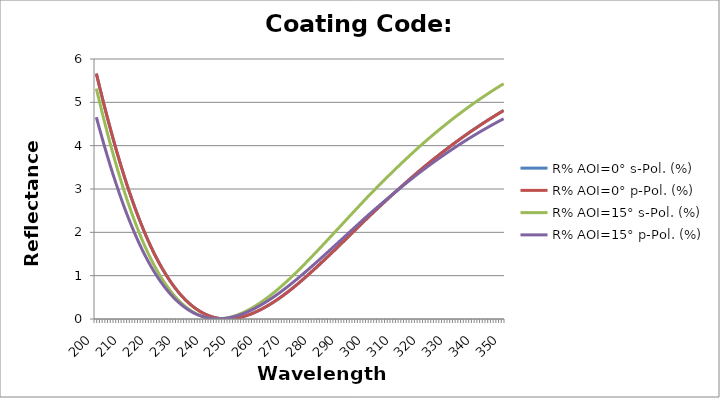
| Category | R% AOI=0° s-Pol. (%) | R% AOI=0° p-Pol. (%) | R% AOI=15° s-Pol. (%) | R% AOI=15° p-Pol. (%) |
|---|---|---|---|---|
| 200.0 | 5.663 | 5.663 | 5.316 | 4.657 |
| 201.0 | 5.404 | 5.404 | 5.054 | 4.426 |
| 202.0 | 5.15 | 5.15 | 4.798 | 4.201 |
| 203.0 | 4.903 | 4.903 | 4.549 | 3.983 |
| 204.0 | 4.662 | 4.662 | 4.307 | 3.77 |
| 205.0 | 4.426 | 4.426 | 4.072 | 3.564 |
| 206.0 | 4.198 | 4.198 | 3.843 | 3.365 |
| 207.0 | 3.975 | 3.975 | 3.622 | 3.171 |
| 208.0 | 3.759 | 3.759 | 3.408 | 2.984 |
| 209.0 | 3.55 | 3.55 | 3.201 | 2.803 |
| 210.0 | 3.347 | 3.347 | 3.001 | 2.628 |
| 211.0 | 3.151 | 3.151 | 2.809 | 2.46 |
| 212.0 | 2.962 | 2.962 | 2.624 | 2.299 |
| 213.0 | 2.779 | 2.779 | 2.447 | 2.144 |
| 214.0 | 2.603 | 2.603 | 2.276 | 1.995 |
| 215.0 | 2.434 | 2.434 | 2.112 | 1.852 |
| 216.0 | 2.27 | 2.27 | 1.955 | 1.715 |
| 217.0 | 2.113 | 2.113 | 1.805 | 1.584 |
| 218.0 | 1.963 | 1.963 | 1.662 | 1.459 |
| 219.0 | 1.819 | 1.819 | 1.525 | 1.34 |
| 220.0 | 1.68 | 1.68 | 1.395 | 1.227 |
| 221.0 | 1.55 | 1.55 | 1.273 | 1.12 |
| 222.0 | 1.425 | 1.425 | 1.157 | 1.019 |
| 223.0 | 1.307 | 1.307 | 1.048 | 0.924 |
| 224.0 | 1.194 | 1.194 | 0.945 | 0.834 |
| 225.0 | 1.087 | 1.087 | 0.848 | 0.749 |
| 226.0 | 0.986 | 0.986 | 0.756 | 0.669 |
| 227.0 | 0.891 | 0.891 | 0.671 | 0.595 |
| 228.0 | 0.801 | 0.801 | 0.591 | 0.525 |
| 229.0 | 0.716 | 0.716 | 0.517 | 0.46 |
| 230.0 | 0.637 | 0.637 | 0.449 | 0.401 |
| 231.0 | 0.563 | 0.563 | 0.386 | 0.345 |
| 232.0 | 0.494 | 0.494 | 0.328 | 0.295 |
| 233.0 | 0.43 | 0.43 | 0.276 | 0.249 |
| 234.0 | 0.371 | 0.371 | 0.228 | 0.207 |
| 235.0 | 0.317 | 0.317 | 0.185 | 0.169 |
| 236.0 | 0.268 | 0.268 | 0.148 | 0.136 |
| 237.0 | 0.223 | 0.223 | 0.114 | 0.106 |
| 238.0 | 0.182 | 0.182 | 0.086 | 0.081 |
| 239.0 | 0.146 | 0.146 | 0.061 | 0.059 |
| 240.0 | 0.114 | 0.114 | 0.042 | 0.041 |
| 241.0 | 0.087 | 0.087 | 0.026 | 0.027 |
| 242.0 | 0.063 | 0.063 | 0.014 | 0.016 |
| 243.0 | 0.043 | 0.043 | 0.006 | 0.009 |
| 244.0 | 0.027 | 0.027 | 0.002 | 0.005 |
| 245.0 | 0.015 | 0.015 | 0.002 | 0.004 |
| 246.0 | 0.007 | 0.007 | 0.006 | 0.006 |
| 247.0 | 0.002 | 0.002 | 0.013 | 0.012 |
| 248.0 | 0 | 0 | 0.023 | 0.02 |
| 249.0 | 0.002 | 0.002 | 0.036 | 0.031 |
| 250.0 | 0.006 | 0.006 | 0.053 | 0.044 |
| 251.0 | 0.014 | 0.014 | 0.072 | 0.06 |
| 252.0 | 0.025 | 0.025 | 0.094 | 0.078 |
| 253.0 | 0.038 | 0.038 | 0.119 | 0.099 |
| 254.0 | 0.054 | 0.054 | 0.147 | 0.122 |
| 255.0 | 0.073 | 0.073 | 0.176 | 0.147 |
| 256.0 | 0.094 | 0.094 | 0.209 | 0.174 |
| 257.0 | 0.117 | 0.117 | 0.243 | 0.203 |
| 258.0 | 0.143 | 0.143 | 0.28 | 0.234 |
| 259.0 | 0.171 | 0.171 | 0.319 | 0.266 |
| 260.0 | 0.201 | 0.201 | 0.359 | 0.301 |
| 261.0 | 0.233 | 0.233 | 0.402 | 0.337 |
| 262.0 | 0.267 | 0.267 | 0.447 | 0.374 |
| 263.0 | 0.302 | 0.302 | 0.493 | 0.414 |
| 264.0 | 0.34 | 0.34 | 0.541 | 0.454 |
| 265.0 | 0.38 | 0.38 | 0.59 | 0.496 |
| 266.0 | 0.42 | 0.42 | 0.642 | 0.54 |
| 267.0 | 0.463 | 0.463 | 0.694 | 0.584 |
| 268.0 | 0.507 | 0.507 | 0.748 | 0.63 |
| 269.0 | 0.552 | 0.552 | 0.803 | 0.677 |
| 270.0 | 0.599 | 0.599 | 0.859 | 0.725 |
| 271.0 | 0.648 | 0.648 | 0.918 | 0.774 |
| 272.0 | 0.698 | 0.698 | 0.977 | 0.824 |
| 273.0 | 0.749 | 0.749 | 1.037 | 0.875 |
| 274.0 | 0.801 | 0.801 | 1.099 | 0.927 |
| 275.0 | 0.854 | 0.854 | 1.161 | 0.979 |
| 276.0 | 0.908 | 0.908 | 1.224 | 1.032 |
| 277.0 | 0.963 | 0.963 | 1.287 | 1.086 |
| 278.0 | 1.019 | 1.019 | 1.352 | 1.14 |
| 279.0 | 1.075 | 1.075 | 1.416 | 1.195 |
| 280.0 | 1.132 | 1.132 | 1.482 | 1.25 |
| 281.0 | 1.19 | 1.19 | 1.547 | 1.306 |
| 282.0 | 1.248 | 1.248 | 1.613 | 1.362 |
| 283.0 | 1.307 | 1.307 | 1.68 | 1.418 |
| 284.0 | 1.366 | 1.366 | 1.747 | 1.475 |
| 285.0 | 1.426 | 1.426 | 1.814 | 1.531 |
| 286.0 | 1.486 | 1.486 | 1.881 | 1.588 |
| 287.0 | 1.546 | 1.546 | 1.948 | 1.646 |
| 288.0 | 1.606 | 1.606 | 2.016 | 1.703 |
| 289.0 | 1.667 | 1.667 | 2.083 | 1.76 |
| 290.0 | 1.728 | 1.728 | 2.151 | 1.818 |
| 291.0 | 1.789 | 1.789 | 2.219 | 1.875 |
| 292.0 | 1.851 | 1.851 | 2.286 | 1.933 |
| 293.0 | 1.912 | 1.912 | 2.354 | 1.99 |
| 294.0 | 1.973 | 1.973 | 2.421 | 2.048 |
| 295.0 | 2.035 | 2.035 | 2.489 | 2.105 |
| 296.0 | 2.096 | 2.096 | 2.556 | 2.162 |
| 297.0 | 2.158 | 2.158 | 2.623 | 2.219 |
| 298.0 | 2.219 | 2.219 | 2.69 | 2.276 |
| 299.0 | 2.28 | 2.28 | 2.756 | 2.333 |
| 300.0 | 2.341 | 2.341 | 2.823 | 2.39 |
| 301.0 | 2.4 | 2.4 | 2.887 | 2.445 |
| 302.0 | 2.46 | 2.46 | 2.951 | 2.499 |
| 303.0 | 2.519 | 2.519 | 3.015 | 2.554 |
| 304.0 | 2.578 | 2.578 | 3.078 | 2.608 |
| 305.0 | 2.636 | 2.636 | 3.142 | 2.662 |
| 306.0 | 2.694 | 2.694 | 3.204 | 2.715 |
| 307.0 | 2.752 | 2.752 | 3.266 | 2.768 |
| 308.0 | 2.81 | 2.81 | 3.328 | 2.821 |
| 309.0 | 2.867 | 2.867 | 3.389 | 2.873 |
| 310.0 | 2.924 | 2.924 | 3.45 | 2.925 |
| 311.0 | 2.98 | 2.98 | 3.511 | 2.977 |
| 312.0 | 3.036 | 3.036 | 3.57 | 3.028 |
| 313.0 | 3.092 | 3.092 | 3.63 | 3.079 |
| 314.0 | 3.148 | 3.148 | 3.689 | 3.13 |
| 315.0 | 3.203 | 3.203 | 3.748 | 3.18 |
| 316.0 | 3.258 | 3.258 | 3.806 | 3.23 |
| 317.0 | 3.312 | 3.312 | 3.864 | 3.279 |
| 318.0 | 3.366 | 3.366 | 3.921 | 3.328 |
| 319.0 | 3.42 | 3.42 | 3.978 | 3.377 |
| 320.0 | 3.473 | 3.473 | 4.034 | 3.425 |
| 321.0 | 3.525 | 3.525 | 4.089 | 3.472 |
| 322.0 | 3.576 | 3.576 | 4.143 | 3.518 |
| 323.0 | 3.627 | 3.627 | 4.197 | 3.564 |
| 324.0 | 3.678 | 3.678 | 4.25 | 3.61 |
| 325.0 | 3.728 | 3.728 | 4.302 | 3.654 |
| 326.0 | 3.777 | 3.777 | 4.354 | 3.699 |
| 327.0 | 3.826 | 3.826 | 4.406 | 3.743 |
| 328.0 | 3.874 | 3.874 | 4.456 | 3.787 |
| 329.0 | 3.922 | 3.922 | 4.507 | 3.83 |
| 330.0 | 3.97 | 3.97 | 4.556 | 3.872 |
| 331.0 | 4.017 | 4.017 | 4.605 | 3.914 |
| 332.0 | 4.063 | 4.063 | 4.654 | 3.956 |
| 333.0 | 4.109 | 4.109 | 4.702 | 3.997 |
| 334.0 | 4.155 | 4.155 | 4.749 | 4.038 |
| 335.0 | 4.2 | 4.2 | 4.796 | 4.078 |
| 336.0 | 4.244 | 4.244 | 4.842 | 4.118 |
| 337.0 | 4.288 | 4.288 | 4.888 | 4.157 |
| 338.0 | 4.331 | 4.331 | 4.933 | 4.195 |
| 339.0 | 4.374 | 4.374 | 4.977 | 4.234 |
| 340.0 | 4.416 | 4.416 | 5.021 | 4.271 |
| 341.0 | 4.458 | 4.458 | 5.065 | 4.308 |
| 342.0 | 4.5 | 4.5 | 5.107 | 4.345 |
| 343.0 | 4.54 | 4.54 | 5.15 | 4.381 |
| 344.0 | 4.581 | 4.581 | 5.191 | 4.417 |
| 345.0 | 4.62 | 4.62 | 5.232 | 4.452 |
| 346.0 | 4.66 | 4.66 | 5.273 | 4.487 |
| 347.0 | 4.698 | 4.698 | 5.313 | 4.521 |
| 348.0 | 4.737 | 4.737 | 5.352 | 4.555 |
| 349.0 | 4.774 | 4.774 | 5.391 | 4.588 |
| 350.0 | 4.812 | 4.812 | 5.429 | 4.621 |